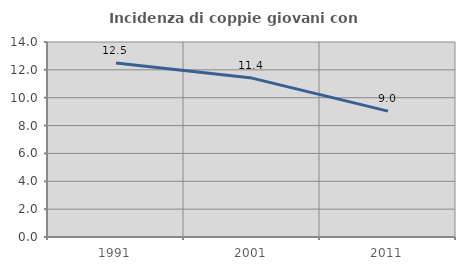
| Category | Incidenza di coppie giovani con figli |
|---|---|
| 1991.0 | 12.5 |
| 2001.0 | 11.409 |
| 2011.0 | 9.036 |